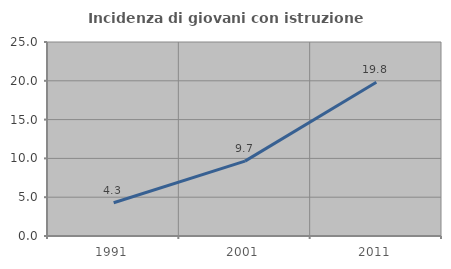
| Category | Incidenza di giovani con istruzione universitaria |
|---|---|
| 1991.0 | 4.278 |
| 2001.0 | 9.653 |
| 2011.0 | 19.821 |